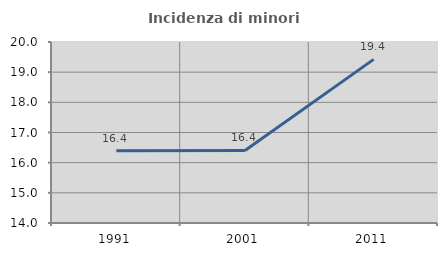
| Category | Incidenza di minori stranieri |
|---|---|
| 1991.0 | 16.393 |
| 2001.0 | 16.406 |
| 2011.0 | 19.424 |